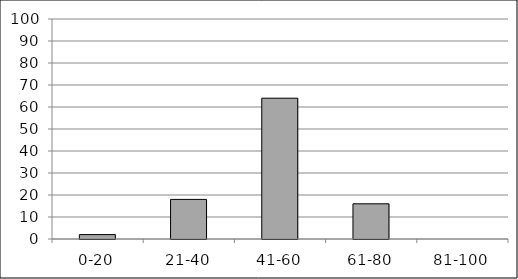
| Category | Series 0 |
|---|---|
| 0-20 | 2 |
| 21-40 | 18 |
| 41-60 | 64 |
| 61-80 | 16 |
| 81-100 | 0 |